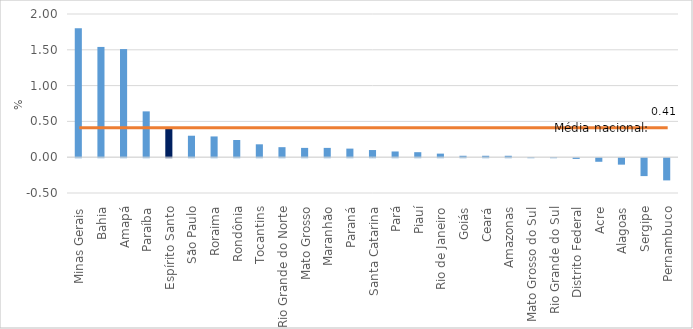
| Category | Escolha |
|---|---|
| Minas Gerais | 1.8 |
| Bahia | 1.54 |
| Amapá | 1.51 |
| Paraíba | 0.64 |
| Espírito Santo | 0.41 |
| São Paulo | 0.3 |
| Roraima | 0.29 |
| Rondônia | 0.24 |
| Tocantins | 0.18 |
| Rio Grande do Norte | 0.14 |
| Mato Grosso | 0.13 |
| Maranhão | 0.13 |
| Paraná | 0.12 |
| Santa Catarina | 0.1 |
| Pará | 0.08 |
| Piauí | 0.07 |
| Rio de Janeiro | 0.05 |
| Goiás | 0.02 |
| Ceará | 0.02 |
| Amazonas | 0.02 |
| Mato Grosso do Sul | 0 |
| Rio Grande do Sul | 0 |
| Distrito Federal | -0.01 |
| Acre | -0.05 |
| Alagoas | -0.09 |
| Sergipe | -0.25 |
| Pernambuco | -0.31 |